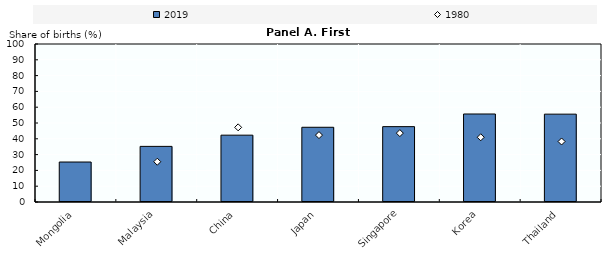
| Category | 2019 |
|---|---|
| Mongolia | 25.3 |
| Malaysia | 35.2 |
| China | 42.3 |
| Japan | 47.3 |
| Singapore | 47.7 |
| Korea | 55.7 |
| Thailand | 55.6 |